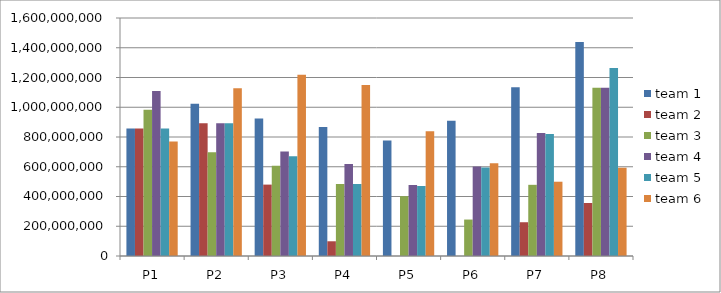
| Category | team 1 | team 2 | team 3 | team 4 | team 5 | team 6 |
|---|---|---|---|---|---|---|
| P1 | 857000000 | 857000000 | 983000000 | 1109000000 | 857000000 | 769000000 |
| P2 | 1023000000 | 893000000 | 698000000 | 893000000 | 893000000 | 1127000000 |
| P3 | 925000000 | 480000000 | 607000000 | 703000000 | 671000000 | 1218000000 |
| P4 | 868000000 | 99000000 | 484000000 | 618000000 | 484000000 | 1150000000 |
| P5 | 777300000 | 0 | 402290000 | 477300000 | 470500000 | 838700000 |
| P6 | 910000000 | 0 | 245000000 | 602000000 | 595000000 | 623000000 |
| P7 | 1135000000 | 227000000 | 478500000 | 827700000 | 820700000 | 499400000 |
| P8 | 1439000000 | 356260000 | 1131660000 | 1131650000 | 1264380000 | 593770000 |